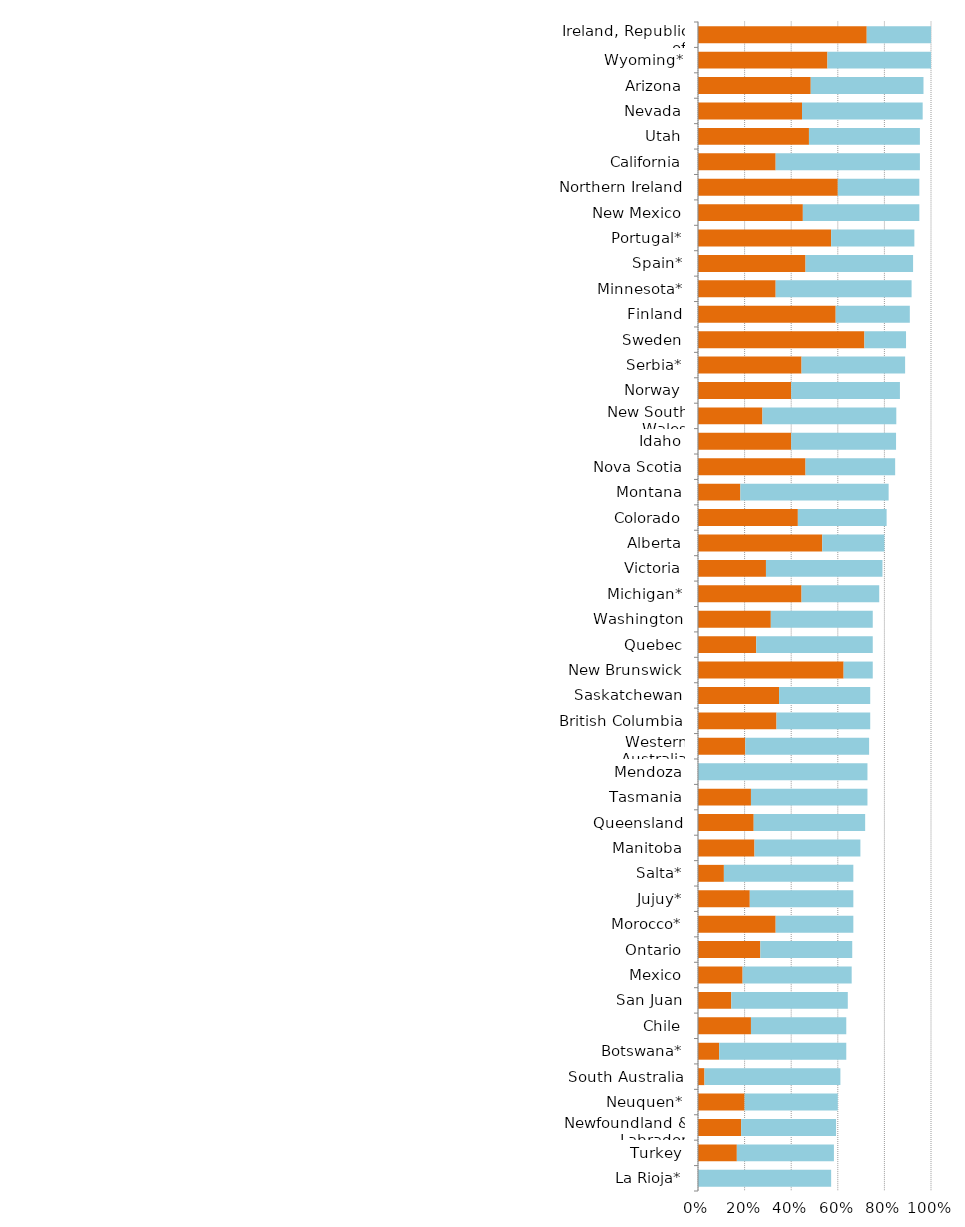
| Category | Series 0 | Series 1 |
|---|---|---|
| La Rioja* | 0 | 0.571 |
| Turkey | 0.167 | 0.417 |
| Newfoundland & Labrador | 0.185 | 0.407 |
| Neuquen* | 0.2 | 0.4 |
| South Australia | 0.028 | 0.583 |
| Botswana* | 0.091 | 0.545 |
| Chile | 0.227 | 0.409 |
| San Juan | 0.143 | 0.5 |
| Mexico | 0.191 | 0.468 |
| Ontario | 0.268 | 0.394 |
| Morocco* | 0.333 | 0.333 |
| Jujuy* | 0.222 | 0.444 |
| Salta* | 0.111 | 0.556 |
| Manitoba | 0.242 | 0.455 |
| Queensland | 0.239 | 0.478 |
| Tasmania | 0.227 | 0.5 |
| Mendoza | 0 | 0.727 |
| Western Australia | 0.203 | 0.531 |
| British Columbia | 0.337 | 0.402 |
| Saskatchewan | 0.348 | 0.391 |
| New Brunswick | 0.625 | 0.125 |
| Quebec | 0.25 | 0.5 |
| Washington | 0.312 | 0.438 |
| Michigan* | 0.444 | 0.333 |
| Victoria | 0.292 | 0.5 |
| Alberta | 0.533 | 0.267 |
| Colorado | 0.429 | 0.381 |
| Montana | 0.182 | 0.636 |
| Nova Scotia | 0.462 | 0.385 |
| Idaho | 0.4 | 0.45 |
| New South Wales | 0.277 | 0.574 |
| Norway | 0.4 | 0.467 |
| Serbia* | 0.444 | 0.444 |
| Sweden | 0.714 | 0.179 |
| Finland | 0.591 | 0.318 |
| Minnesota* | 0.333 | 0.583 |
| Spain* | 0.462 | 0.462 |
| Portugal* | 0.571 | 0.357 |
| New Mexico | 0.45 | 0.5 |
| Northern Ireland | 0.6 | 0.35 |
| California | 0.333 | 0.619 |
| Utah | 0.476 | 0.476 |
| Nevada | 0.446 | 0.518 |
| Arizona | 0.484 | 0.484 |
| Wyoming* | 0.556 | 0.444 |
| Ireland, Republic of | 0.724 | 0.276 |